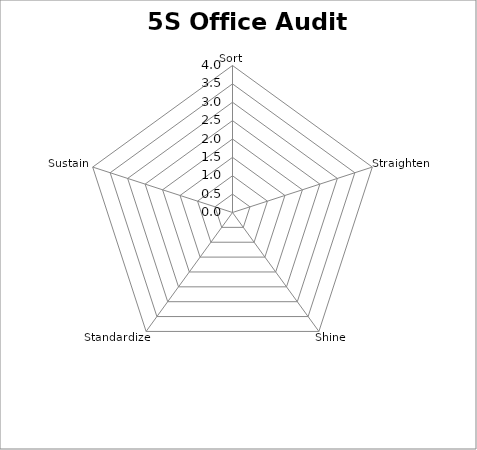
| Category | Series 0 |
|---|---|
| Sort | 0 |
| Straighten | 0 |
| Shine | 0 |
| Standardize | 0 |
| Sustain | 0 |